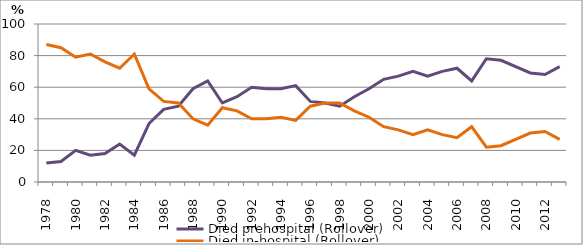
| Category | Died prehospital (Rollover) | Died in-hospital (Rollover) |
|---|---|---|
| 1978.0 | 12 | 87 |
| 1979.0 | 13 | 85 |
| 1980.0 | 20 | 79 |
| 1981.0 | 17 | 81 |
| 1982.0 | 18 | 76 |
| 1983.0 | 24 | 72 |
| 1984.0 | 17 | 81 |
| 1985.0 | 37 | 59 |
| 1986.0 | 46 | 51 |
| 1987.0 | 48 | 50 |
| 1988.0 | 59 | 40 |
| 1989.0 | 64 | 36 |
| 1990.0 | 50 | 47 |
| 1991.0 | 54 | 45 |
| 1992.0 | 60 | 40 |
| 1993.0 | 59 | 40 |
| 1994.0 | 59 | 41 |
| 1995.0 | 61 | 39 |
| 1996.0 | 51 | 48 |
| 1997.0 | 50 | 50 |
| 1998.0 | 48 | 50 |
| 1999.0 | 54 | 45 |
| 2000.0 | 59 | 41 |
| 2001.0 | 65 | 35 |
| 2002.0 | 67 | 33 |
| 2003.0 | 70 | 30 |
| 2004.0 | 67 | 33 |
| 2005.0 | 70 | 30 |
| 2006.0 | 72 | 28 |
| 2007.0 | 64 | 35 |
| 2008.0 | 78 | 22 |
| 2009.0 | 77 | 23 |
| 2010.0 | 73 | 27 |
| 2011.0 | 69 | 31 |
| 2012.0 | 68 | 32 |
| 2013.0 | 73 | 27 |